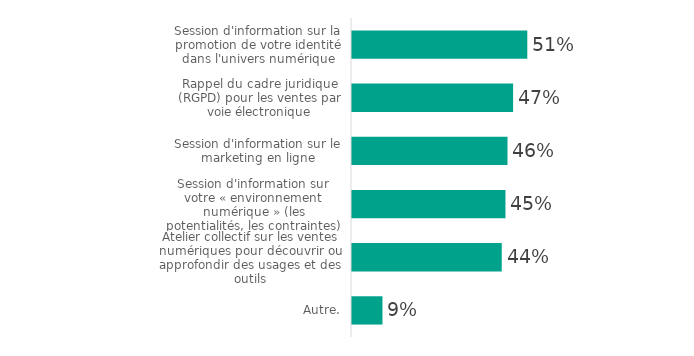
| Category | Series 0 |
|---|---|
| Session d'information sur la promotion de votre identité dans l'univers numérique | 51.407 |
| Rappel du cadre juridique (RGPD) pour les ventes par voie électronique | 47.245 |
| Session d'information sur le marketing en ligne | 45.598 |
| Session d'information sur votre « environnement numérique » (les potentialités, les contraintes) | 45.009 |
| Atelier collectif sur les ventes numériques pour découvrir ou approfondir des usages et des outils | 43.915 |
| Autre. | 8.938 |